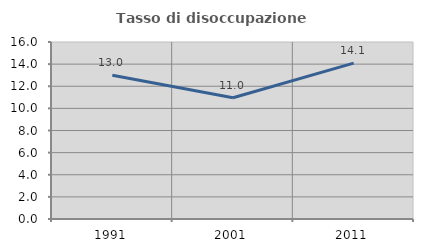
| Category | Tasso di disoccupazione giovanile  |
|---|---|
| 1991.0 | 12.992 |
| 2001.0 | 10.959 |
| 2011.0 | 14.094 |